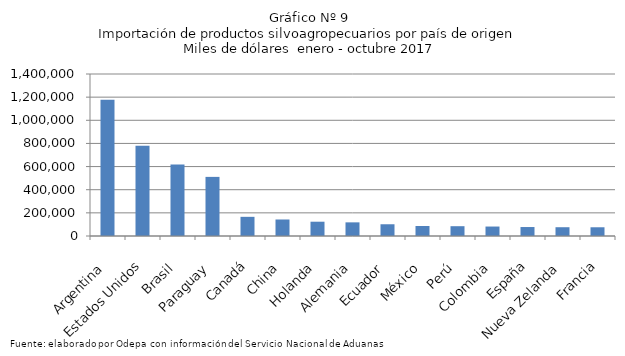
| Category | Series 0 |
|---|---|
| Argentina | 1178349.313 |
| Estados Unidos | 779667.636 |
| Brasil | 617461.066 |
| Paraguay | 510866.779 |
| Canadá | 165643.071 |
| China | 142652.008 |
| Holanda | 123507.358 |
| Alemania | 117910.742 |
| Ecuador | 101485.415 |
| México | 86347.165 |
| Perú | 84715.46 |
| Colombia | 81756.237 |
| España | 77539.265 |
| Nueva Zelanda | 75895.266 |
| Francia | 75462.052 |